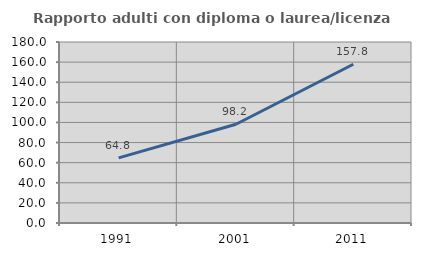
| Category | Rapporto adulti con diploma o laurea/licenza media  |
|---|---|
| 1991.0 | 64.807 |
| 2001.0 | 98.168 |
| 2011.0 | 157.848 |